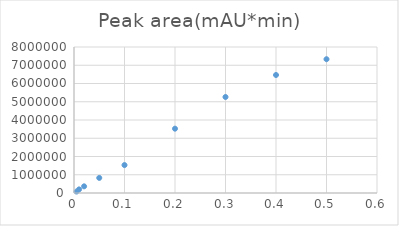
| Category | Peak area(mAU*min) |
|---|---|
| 0.5 | 7330198 |
| 0.4 | 6466145 |
| 0.3 | 5260521 |
| 0.2 | 3524574 |
| 0.1 | 1530688 |
| 0.05 | 827364 |
| 0.02 | 365408 |
| 0.01 | 197435 |
| 0.005 | 78353 |